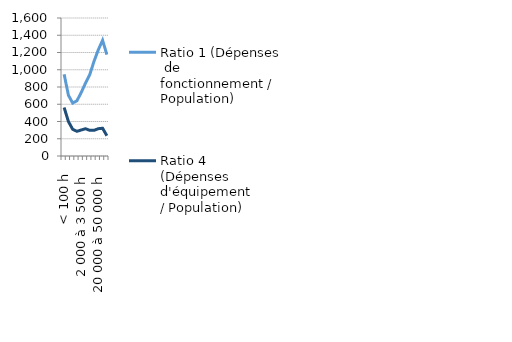
| Category | Ratio 1 (Dépenses  de fonctionnement / Population) | Ratio 4 
(Dépenses d'équipement 
/ Population) |
|---|---|---|
| < 100 h | 947.17 | 562.145 |
| 100 à 200 h | 704.806 | 399.804 |
| 200 à 500 h | 613.477 | 309.25 |
| 500 à 2 000 h | 640.714 | 286.094 |
| 2 000 à 3 500 h | 736.382 | 301.429 |
| 3 500 à 5 000 h | 844.948 | 316.298 |
| 5 000 à 10 000 h | 944.308 | 297.505 |
| 10 000 à 20 000 h | 1098.717 | 297.377 |
| 20 000 à 50 000 h | 1231.764 | 316.68 |
| 50 000 à 100 000 h | 1341.581 | 321.711 |
| >=100 000 h hors Paris | 1175.03 | 235.131 |